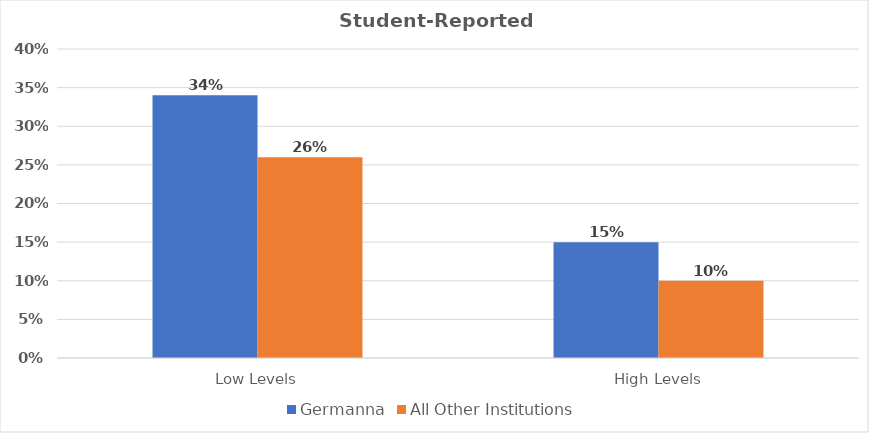
| Category | Germanna | All Other Institutions |
|---|---|---|
| Low Levels 
 | 0.34 | 0.26 |
| High Levels 
 | 0.15 | 0.1 |